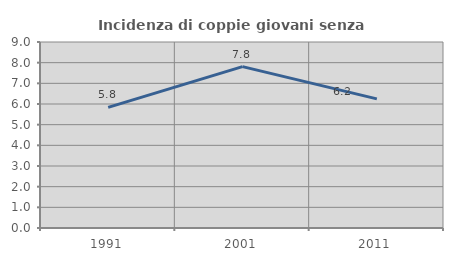
| Category | Incidenza di coppie giovani senza figli |
|---|---|
| 1991.0 | 5.839 |
| 2001.0 | 7.807 |
| 2011.0 | 6.247 |